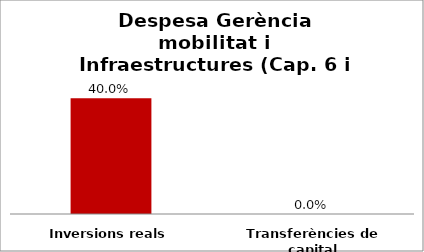
| Category | Series 0 |
|---|---|
| Inversions reals | 0.4 |
| Transferències de capital | 0 |